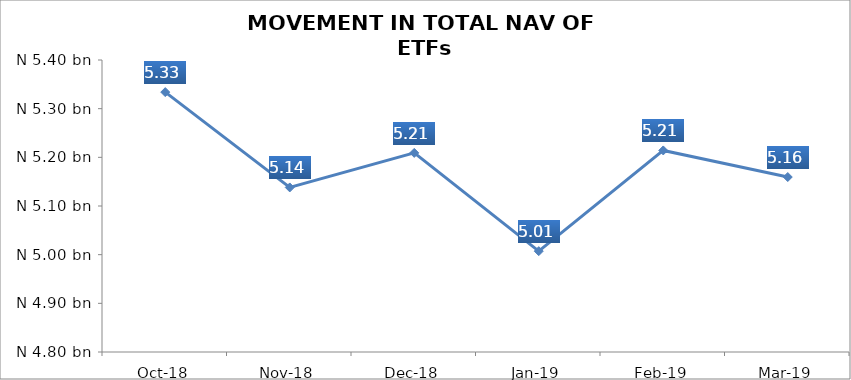
| Category | Series 0 |
|---|---|
| 2018-10-01 | 5333989892.62 |
| 2018-11-01 | 5138140059.08 |
| 2018-12-01 | 5209127720.29 |
| 2019-01-01 | 5007243642.12 |
| 2019-02-01 | 5214161600.39 |
| 2019-03-01 | 5159546061.43 |